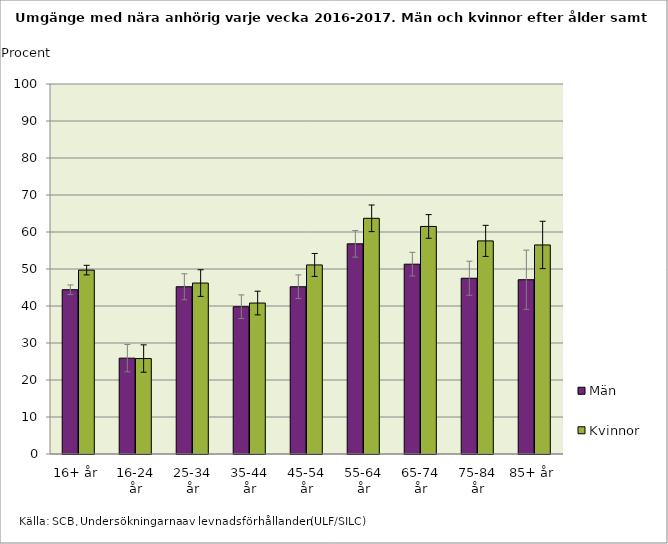
| Category | Män | Kvinnor |
|---|---|---|
| 16+ år | 44.4 | 49.7 |
| 16-24 år | 25.9 | 25.8 |
| 25-34 år | 45.2 | 46.2 |
| 35-44 år | 39.8 | 40.8 |
| 45-54 år | 45.2 | 51.1 |
| 55-64 år | 56.8 | 63.7 |
| 65-74 år | 51.3 | 61.5 |
| 75-84 år | 47.5 | 57.6 |
| 85+ år | 47.1 | 56.5 |